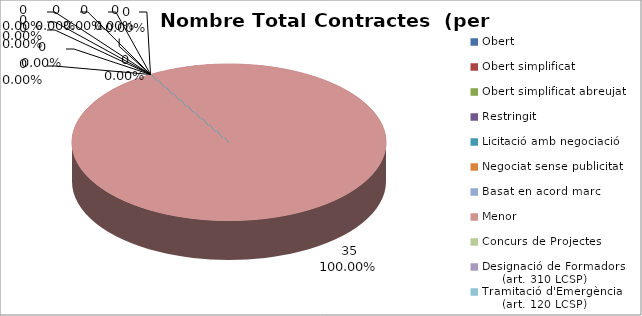
| Category | Nombre Total Contractes |
|---|---|
| Obert | 0 |
| Obert simplificat | 0 |
| Obert simplificat abreujat | 0 |
| Restringit | 0 |
| Licitació amb negociació | 0 |
| Negociat sense publicitat | 0 |
| Basat en acord marc | 0 |
| Menor | 35 |
| Concurs de Projectes | 0 |
| Designació de Formadors
     (art. 310 LCSP) | 0 |
| Tramitació d'Emergència
     (art. 120 LCSP) | 0 |